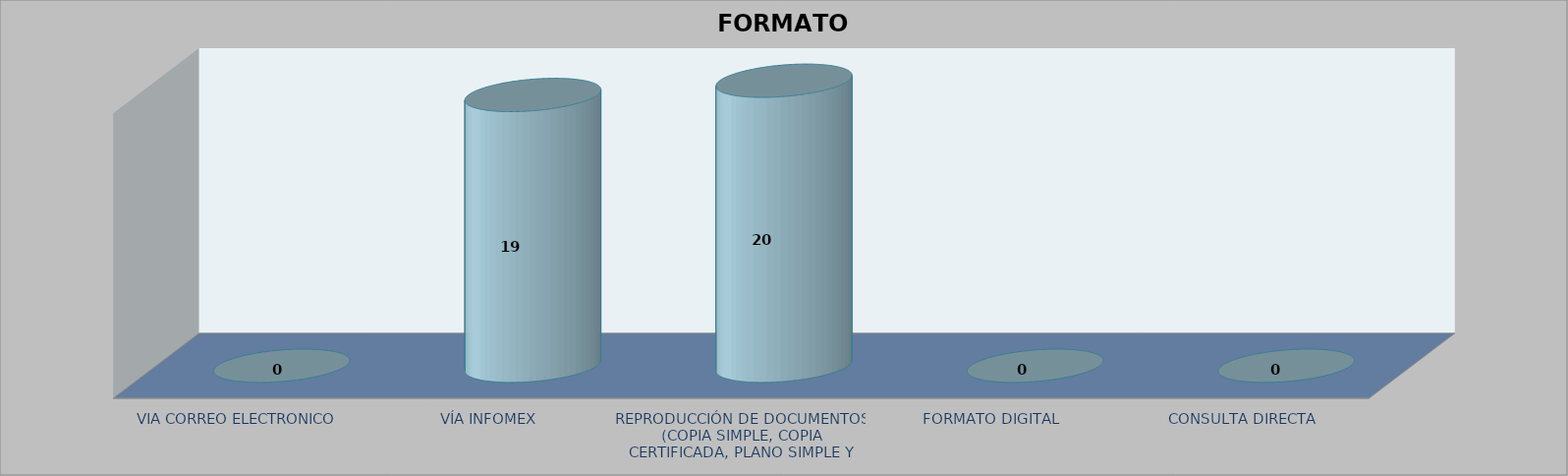
| Category |        FORMATO SOLICITADO | Series 1 | Series 2 |
|---|---|---|---|
| VIA CORREO ELECTRONICO |  |  | 0 |
| VÍA INFOMEX |  |  | 19 |
| REPRODUCCIÓN DE DOCUMENTOS (COPIA SIMPLE, COPIA CERTIFICADA, PLANO SIMPLE Y PLANO CERTIFICADO) |  |  | 20 |
| FORMATO DIGITAL |  |  | 0 |
| CONSULTA DIRECTA |  |  | 0 |